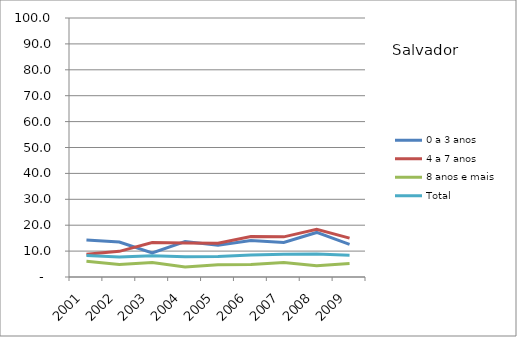
| Category | 0 a 3 anos | 4 a 7 anos | 8 anos e mais | Total |
|---|---|---|---|---|
| 2001.0 | 14.3 | 8.8 | 6.1 | 8.3 |
| 2002.0 | 13.5 | 9.9 | 4.8 | 7.7 |
| 2003.0 | 9.3 | 13.3 | 5.6 | 8.2 |
| 2004.0 | 13.7 | 13.1 | 3.9 | 7.8 |
| 2005.0 | 12.3 | 13 | 4.7 | 7.9 |
| 2006.0 | 14.1 | 15.6 | 4.8 | 8.5 |
| 2007.0 | 13.3 | 15.5 | 5.6 | 8.8 |
| 2008.0 | 17.2 | 18.4 | 4.3 | 8.9 |
| 2009.0 | 12.6 | 15 | 5.2 | 8.4 |